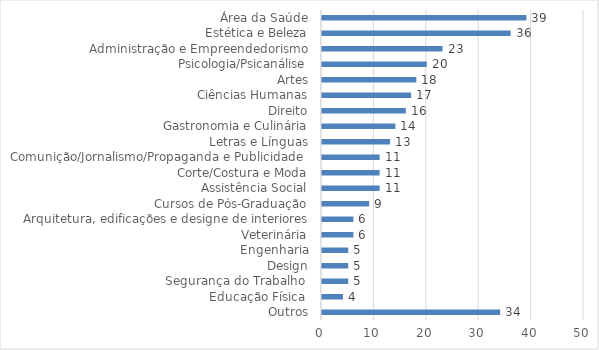
| Category | Series 0 |
|---|---|
| Outros | 34 |
| Educação Física  | 4 |
| Segurança do Trabalho  | 5 |
| Design | 5 |
| Engenharia | 5 |
| Veterinária | 6 |
| Arquitetura, edificações e designe de interiores | 6 |
| Cursos de Pós-Graduação | 9 |
| Assistência Social | 11 |
| Corte/Costura e Moda | 11 |
| Comunição/Jornalismo/Propaganda e Publicidade  | 11 |
| Letras e Línguas | 13 |
| Gastronomia e Culinária | 14 |
| Direito | 16 |
| Ciências Humanas | 17 |
| Artes | 18 |
| Psicologia/Psicanálise | 20 |
| Administração e Empreendedorismo | 23 |
| Estética e Beleza | 36 |
| Área da Saúde | 39 |